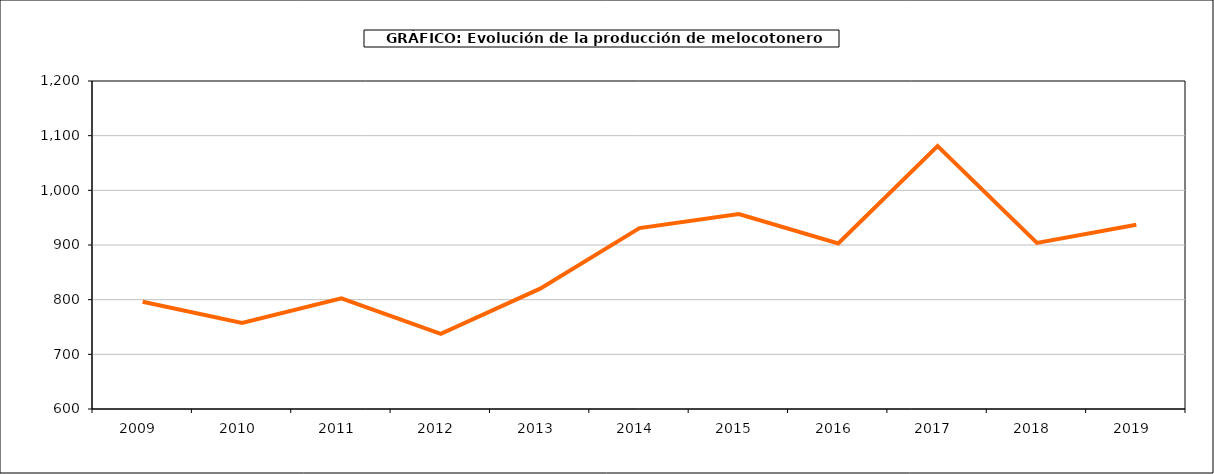
| Category | producción melocotonero |
|---|---|
| 2009.0 | 796.145 |
| 2010.0 | 757.34 |
| 2011.0 | 802.391 |
| 2012.0 | 737.531 |
| 2013.0 | 820.139 |
| 2014.0 | 930.862 |
| 2015.0 | 956.688 |
| 2016.0 | 902.884 |
| 2017.0 | 1081.157 |
| 2018.0 | 903.809 |
| 2019.0 | 937.166 |